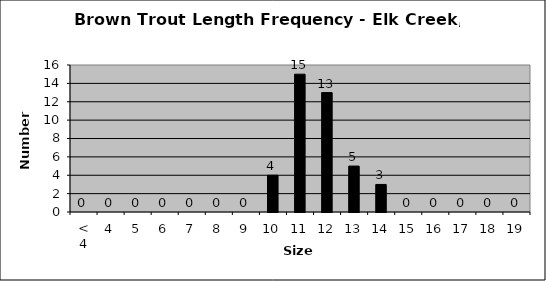
| Category | Series 0 |
|---|---|
| < 4 | 0 |
| 4 | 0 |
| 5 | 0 |
| 6 | 0 |
| 7 | 0 |
| 8 | 0 |
| 9 | 0 |
| 10 | 4 |
| 11 | 15 |
| 12 | 13 |
| 13 | 5 |
| 14 | 3 |
| 15 | 0 |
| 16 | 0 |
| 17 | 0 |
| 18 | 0 |
| 19 | 0 |